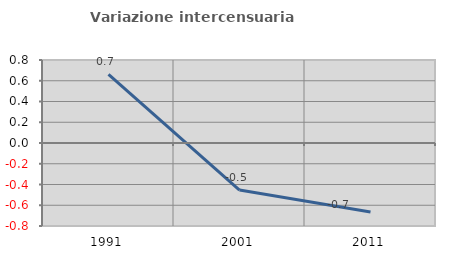
| Category | Variazione intercensuaria annua |
|---|---|
| 1991.0 | 0.661 |
| 2001.0 | -0.453 |
| 2011.0 | -0.665 |